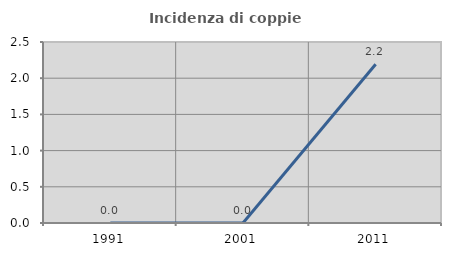
| Category | Incidenza di coppie miste |
|---|---|
| 1991.0 | 0 |
| 2001.0 | 0 |
| 2011.0 | 2.192 |